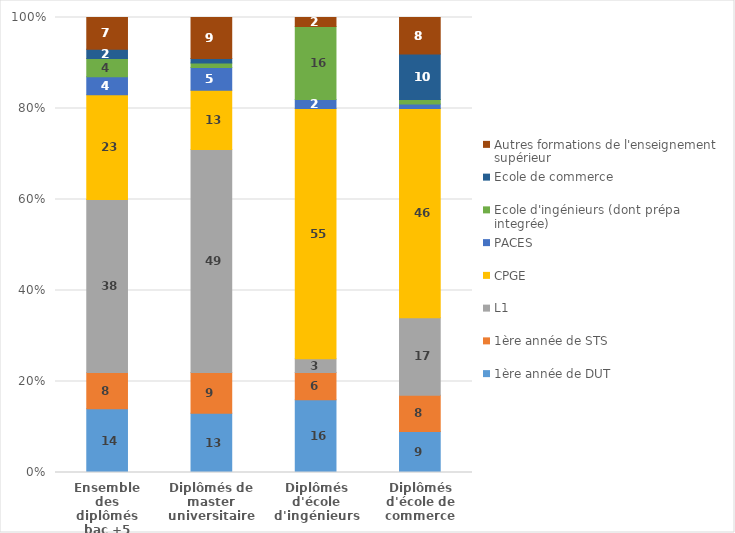
| Category | 1ère année de DUT | 1ère année de STS | L1 | CPGE | PACES | Ecole d'ingénieurs (dont prépa integrée) | Ecole de commerce | Autres formations de l'enseignement supérieur |
|---|---|---|---|---|---|---|---|---|
| Ensemble des diplômés bac +5 | 14 | 8 | 38 | 23 | 4 | 4 | 2 | 7 |
| Diplômés de master universitaire | 13 | 9 | 49 | 13 | 5 | 1 | 1 | 9 |
| Diplômés d'école d'ingénieurs | 16 | 6 | 3 | 55 | 2 | 16 | 0 | 2 |
| Diplômés d'école de commerce | 9 | 8 | 17 | 46 | 1 | 1 | 10 | 8 |